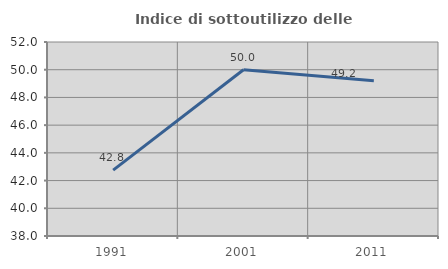
| Category | Indice di sottoutilizzo delle abitazioni  |
|---|---|
| 1991.0 | 42.751 |
| 2001.0 | 50 |
| 2011.0 | 49.211 |